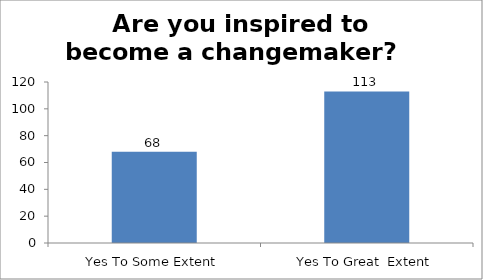
| Category | Are you inspired to become a changemaker?   |
|---|---|
| Yes To Some Extent | 68 |
| Yes To Great  Extent | 113 |